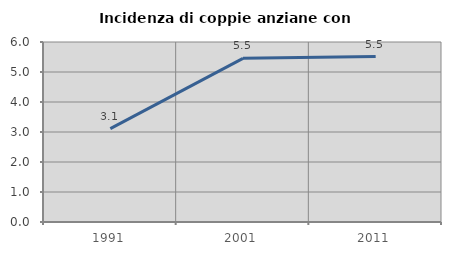
| Category | Incidenza di coppie anziane con figli |
|---|---|
| 1991.0 | 3.113 |
| 2001.0 | 5.455 |
| 2011.0 | 5.515 |